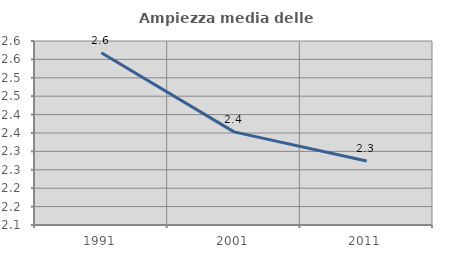
| Category | Ampiezza media delle famiglie |
|---|---|
| 1991.0 | 2.568 |
| 2001.0 | 2.353 |
| 2011.0 | 2.274 |